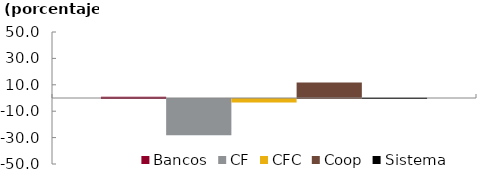
| Category | Bancos | CF | CFC | Coop | Sistema |
|---|---|---|---|---|---|
|  | 0.939 | -27.423 | -2.591 | 11.716 | 0.212 |